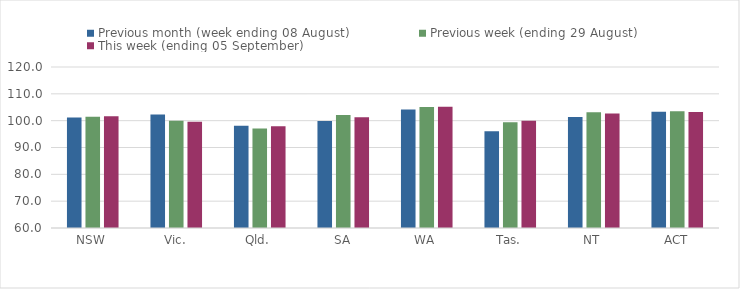
| Category | Previous month (week ending 08 August) | Previous week (ending 29 August) | This week (ending 05 September) |
|---|---|---|---|
| NSW | 101.17 | 101.43 | 101.61 |
| Vic. | 102.32 | 99.93 | 99.6 |
| Qld. | 98.1 | 97.11 | 97.92 |
| SA | 99.83 | 102.09 | 101.25 |
| WA | 104.17 | 105.13 | 105.16 |
| Tas. | 96.09 | 99.42 | 100.01 |
| NT | 101.33 | 103.11 | 102.66 |
| ACT | 103.31 | 103.51 | 103.19 |